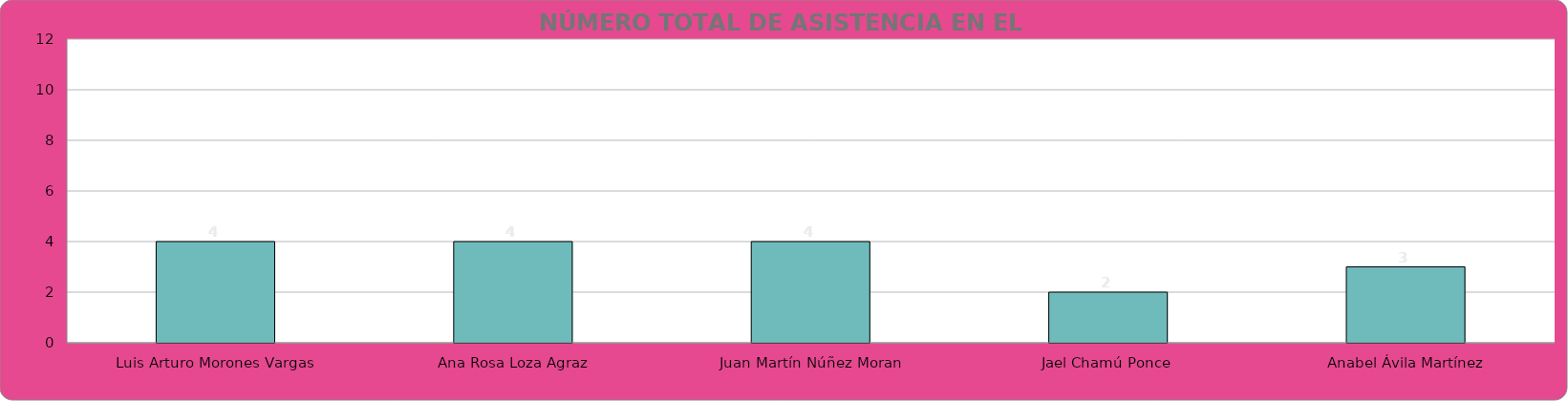
| Category | Jael Chamú Ponce Fernanda Janeth Martínez Núñez Adriana del Carmen Zúñiga Guerrero Ana Rosa Loza Agraz María del Rosario Velázquez Hernández |
|---|---|
| Luis Arturo Morones Vargas | 4 |
| Ana Rosa Loza Agraz | 4 |
| Juan Martín Núñez Moran | 4 |
| Jael Chamú Ponce | 2 |
| Anabel Ávila Martínez | 3 |